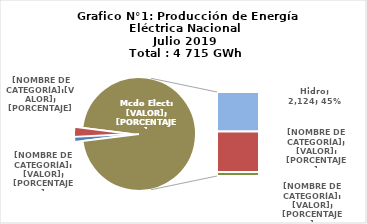
| Category | Series 0 |
|---|---|
| 0 | 56.366 |
| 1 | 131.521 |
| 2 | 2124.068 |
| 3 | 2188.338 |
| 4 | 214.574 |